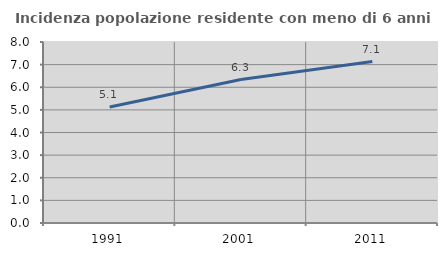
| Category | Incidenza popolazione residente con meno di 6 anni |
|---|---|
| 1991.0 | 5.128 |
| 2001.0 | 6.342 |
| 2011.0 | 7.137 |